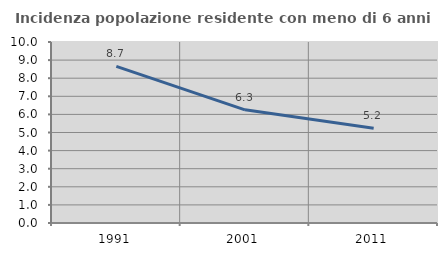
| Category | Incidenza popolazione residente con meno di 6 anni |
|---|---|
| 1991.0 | 8.655 |
| 2001.0 | 6.253 |
| 2011.0 | 5.236 |